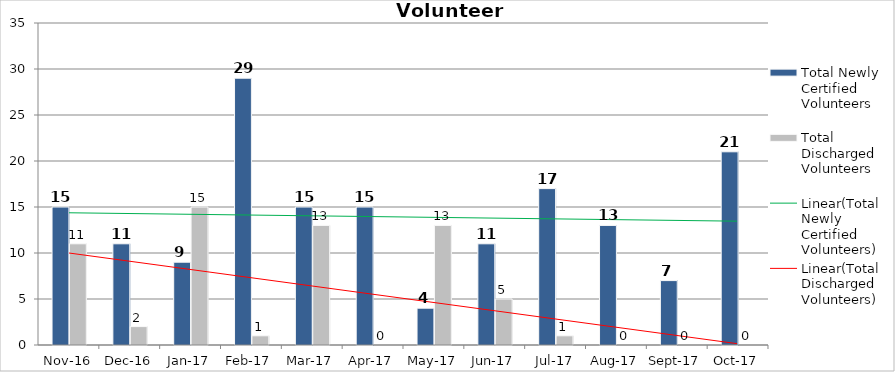
| Category | Total Newly Certified Volunteers | Total Discharged Volunteers |
|---|---|---|
| 2016-11-01 | 15 | 11 |
| 2016-12-01 | 11 | 2 |
| 2017-01-01 | 9 | 15 |
| 2017-02-01 | 29 | 1 |
| 2017-03-01 | 15 | 13 |
| 2017-04-01 | 15 | 0 |
| 2017-05-01 | 4 | 13 |
| 2017-06-01 | 11 | 5 |
| 2017-07-01 | 17 | 1 |
| 2017-08-01 | 13 | 0 |
| 2017-09-01 | 7 | 0 |
| 2017-10-01 | 21 | 0 |